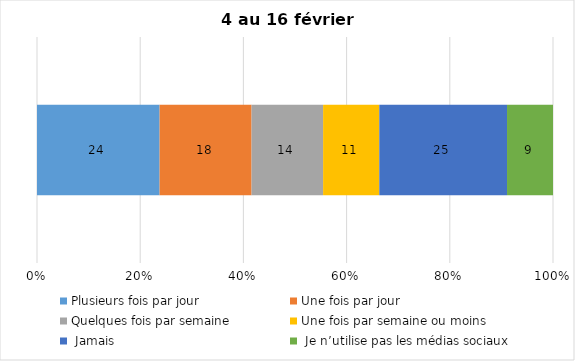
| Category | Plusieurs fois par jour | Une fois par jour | Quelques fois par semaine   | Une fois par semaine ou moins   |  Jamais   |  Je n’utilise pas les médias sociaux |
|---|---|---|---|---|---|---|
| 0 | 24 | 18 | 14 | 11 | 25 | 9 |